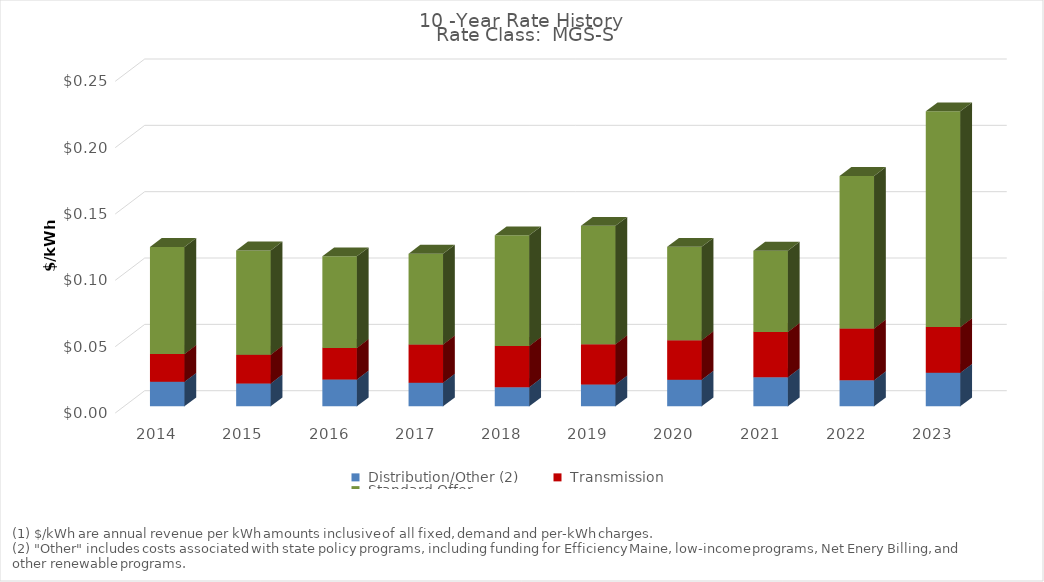
| Category | Series 1 | Series 2 | Series 3 |
|---|---|---|---|
| 2014.0 | 0.018 | 0.021 | 0.081 |
| 2015.0 | 0.017 | 0.022 | 0.078 |
| 2016.0 | 0.02 | 0.024 | 0.069 |
| 2017.0 | 0.018 | 0.029 | 0.068 |
| 2018.0 | 0.014 | 0.031 | 0.083 |
| 2019.0 | 0.016 | 0.03 | 0.089 |
| 2020.0 | 0.02 | 0.03 | 0.07 |
| 2021.0 | 0.022 | 0.034 | 0.061 |
| 2022.0 | 0.02 | 0.039 | 0.115 |
| 2023.0 | 0.025 | 0.035 | 0.163 |